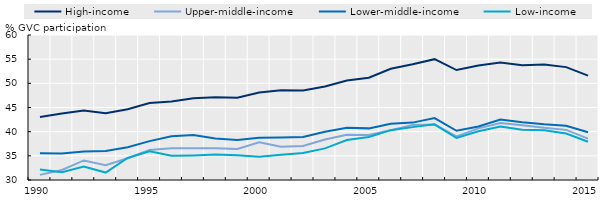
| Category | High-income | Upper-middle-income | Lower-middle-income | Low-income |
|---|---|---|---|---|
| 1990.0 | 43.034 | 31.065 | 35.509 | 32.16 |
| 1991.0 | 43.748 | 32.085 | 35.467 | 31.618 |
| 1992.0 | 44.374 | 34.045 | 35.876 | 32.776 |
| 1993.0 | 43.829 | 33.071 | 35.989 | 31.542 |
| 1994.0 | 44.636 | 34.489 | 36.791 | 34.56 |
| 1995.0 | 45.932 | 36.228 | 38.042 | 35.934 |
| 1996.0 | 46.247 | 36.57 | 39.032 | 35.012 |
| 1997.0 | 46.916 | 36.58 | 39.325 | 35.093 |
| 1998.0 | 47.119 | 36.57 | 38.594 | 35.253 |
| 1999.0 | 47.001 | 36.432 | 38.266 | 35.123 |
| 2000.0 | 48.103 | 37.822 | 38.749 | 34.826 |
| 2001.0 | 48.557 | 36.864 | 38.788 | 35.212 |
| 2002.0 | 48.514 | 37.035 | 38.879 | 35.608 |
| 2003.0 | 49.345 | 38.378 | 39.968 | 36.538 |
| 2004.0 | 50.593 | 39.365 | 40.816 | 38.262 |
| 2005.0 | 51.159 | 39.329 | 40.682 | 38.889 |
| 2006.0 | 53.008 | 40.278 | 41.627 | 40.311 |
| 2007.0 | 53.944 | 41.372 | 41.872 | 40.941 |
| 2008.0 | 55.001 | 41.484 | 42.818 | 41.517 |
| 2009.0 | 52.748 | 39.035 | 40.184 | 38.692 |
| 2010.0 | 53.686 | 40.682 | 41.079 | 40.079 |
| 2011.0 | 54.289 | 41.79 | 42.493 | 41.068 |
| 2012.0 | 53.758 | 41.324 | 41.951 | 40.415 |
| 2013.0 | 53.916 | 40.788 | 41.536 | 40.298 |
| 2014.0 | 53.355 | 40.373 | 41.222 | 39.607 |
| 2015.0 | 51.588 | 38.551 | 39.875 | 37.901 |